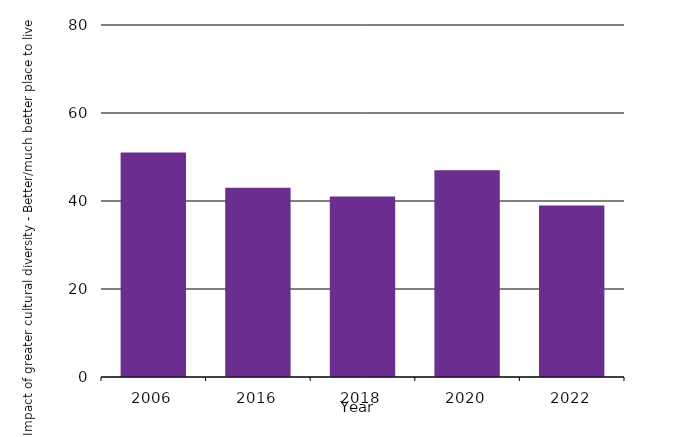
| Category | Impact of greater cultural diversity - Better/much better place to live |
|---|---|
| 2006.0 | 51 |
| 2016.0 | 43 |
| 2018.0 | 41 |
| 2020.0 | 47 |
| 2022.0 | 39 |